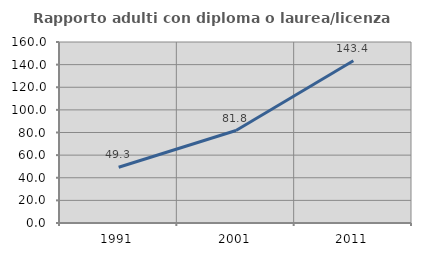
| Category | Rapporto adulti con diploma o laurea/licenza media  |
|---|---|
| 1991.0 | 49.321 |
| 2001.0 | 81.752 |
| 2011.0 | 143.441 |